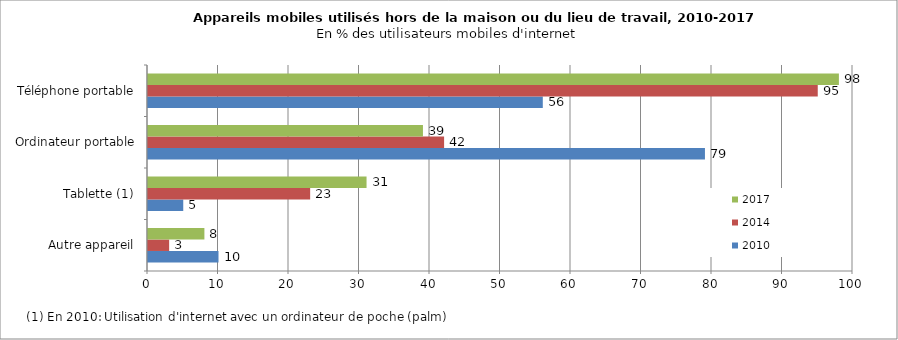
| Category | 2010 | 2014 | 2017 |
|---|---|---|---|
| Autre appareil | 10 | 3 | 8 |
| Tablette (1) | 5 | 23 | 31 |
| Ordinateur portable | 79 | 42 | 39 |
| Téléphone portable | 56 | 95 | 98 |